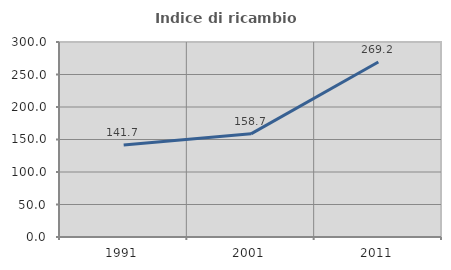
| Category | Indice di ricambio occupazionale  |
|---|---|
| 1991.0 | 141.667 |
| 2001.0 | 158.696 |
| 2011.0 | 269.231 |